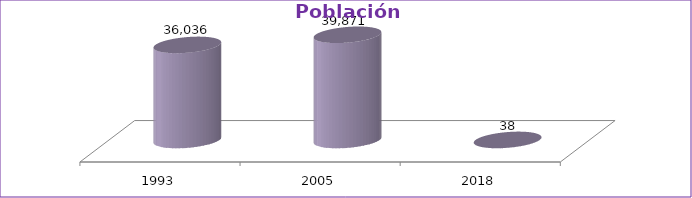
| Category | Población Total |
|---|---|
| 1993 | 36036 |
| 2005 | 39871 |
| 2018 | 37.548 |